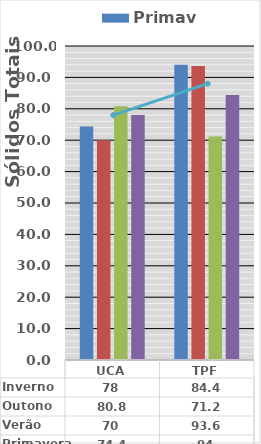
| Category | Primavera | Verão | Outono | Inverno |
|---|---|---|---|---|
| UCA | 74.4 | 70 | 80.8 | 78 |
| TPF | 94 | 93.6 | 71.2 | 84.4 |